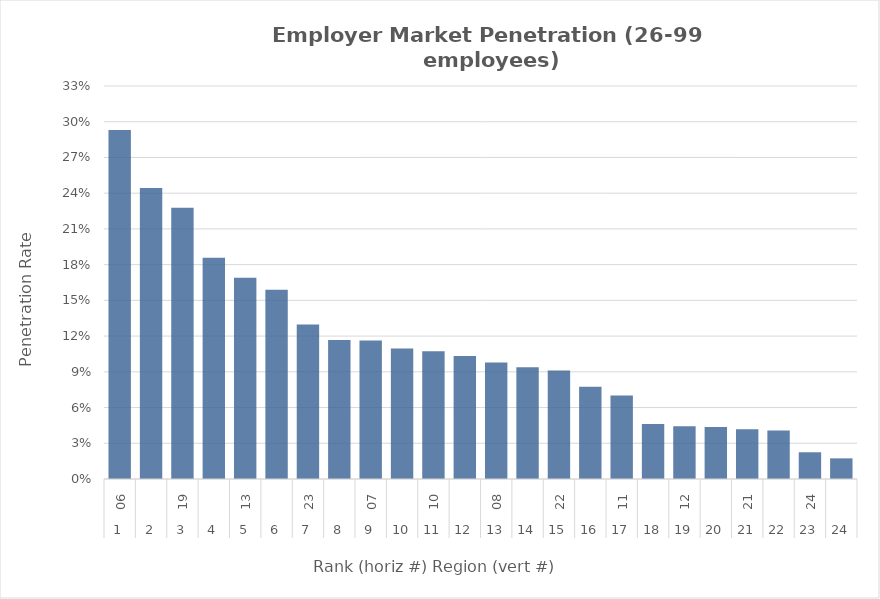
| Category | Rate |
|---|---|
| 0 | 0.293 |
| 1 | 0.244 |
| 2 | 0.228 |
| 3 | 0.186 |
| 4 | 0.169 |
| 5 | 0.159 |
| 6 | 0.13 |
| 7 | 0.117 |
| 8 | 0.116 |
| 9 | 0.11 |
| 10 | 0.107 |
| 11 | 0.103 |
| 12 | 0.098 |
| 13 | 0.094 |
| 14 | 0.091 |
| 15 | 0.077 |
| 16 | 0.07 |
| 17 | 0.046 |
| 18 | 0.044 |
| 19 | 0.044 |
| 20 | 0.042 |
| 21 | 0.041 |
| 22 | 0.022 |
| 23 | 0.017 |